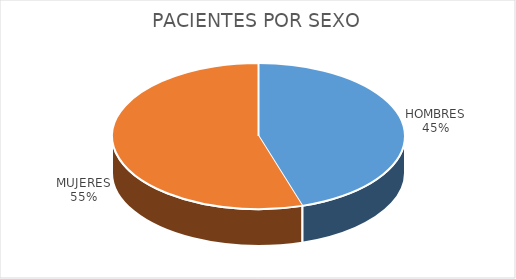
| Category | PACIENTES POR SEXO |
|---|---|
| HOMBRES | 4587 |
| MUJERES | 5566 |